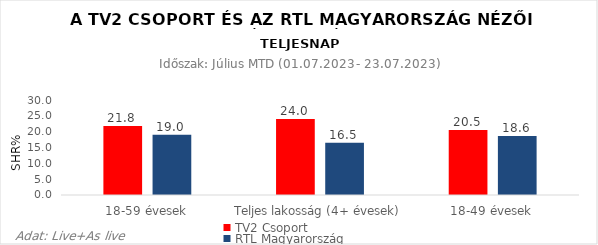
| Category | TV2 Csoport | RTL Magyarország |
|---|---|---|
| 18-59 évesek | 21.8 | 19 |
| Teljes lakosság (4+ évesek) | 24 | 16.5 |
| 18-49 évesek | 20.5 | 18.6 |